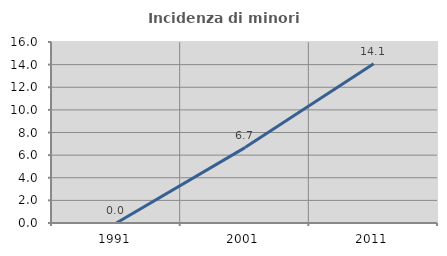
| Category | Incidenza di minori stranieri |
|---|---|
| 1991.0 | 0 |
| 2001.0 | 6.667 |
| 2011.0 | 14.085 |